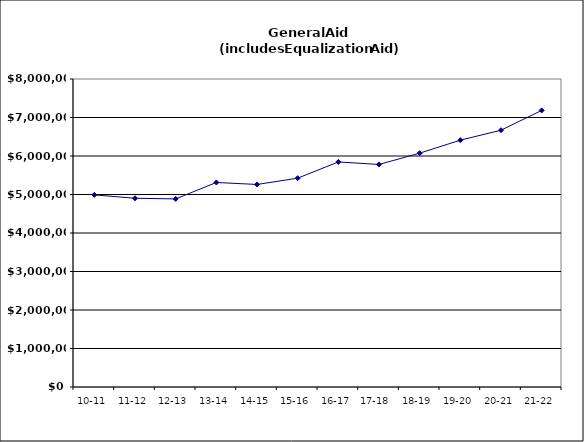
| Category | Series 0 |
|---|---|
| 10-11 | 4990123.11 |
| 11-12 | 4902232.58 |
| 12-13 | 4885487.88 |
| 13-14 | 5312347.11 |
| 14-15 | 5260906.38 |
| 15-16 | 5423931.44 |
| 16-17 | 5845393.17 |
| 17-18  | 5780311.49 |
| 18-19 | 6073514.43 |
| 19-20 | 6411337.98 |
| 20-21 | 6669889.9 |
| 21-22 | 7184225.77 |